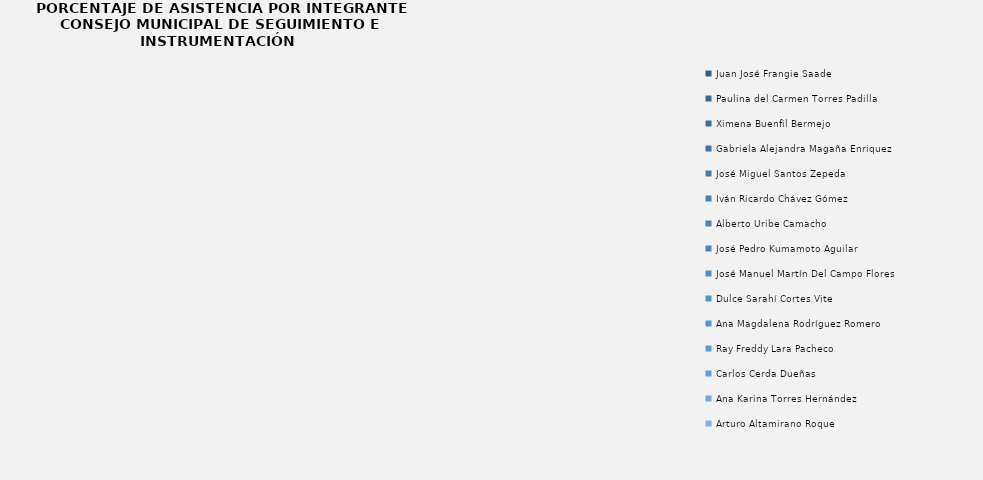
| Category | Juan José Frangie Saade |
|---|---|
| Juan José Frangie Saade | 0 |
| Paulina del Carmen Torres Padilla | 0 |
| Ximena Buenfil Bermejo | 0 |
| Gabriela Alejandra Magaña Enriquez | 0 |
| José Miguel Santos Zepeda | 0 |
| Iván Ricardo Chávez Gómez | 0 |
| Alberto Uribe Camacho | 0 |
| José Pedro Kumamoto Aguilar | 0 |
| José Manuel Martín Del Campo Flores | 0 |
| Dulce Sarahí Cortes Vite | 0 |
| Ana Magdalena Rodríguez Romero | 0 |
| Ray Freddy Lara Pacheco | 0 |
| Carlos Cerda Dueñas | 0 |
| Ana Karina Torres Hernández | 0 |
| Arturo Altamirano Roque  | 0 |